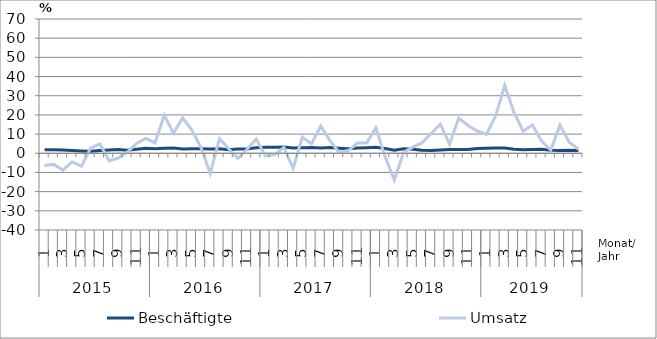
| Category | Beschäftigte | Umsatz |
|---|---|---|
| 0 | 1.8 | -6.4 |
| 1 | 1.8 | -5.8 |
| 2 | 1.7 | -8.8 |
| 3 | 1.5 | -4.4 |
| 4 | 1.2 | -6.8 |
| 5 | 1 | 2.7 |
| 6 | 1.4 | 4.9 |
| 7 | 1.7 | -3.9 |
| 8 | 2 | -2.5 |
| 9 | 1.6 | 0.6 |
| 10 | 2.1 | 5.1 |
| 11 | 2.6 | 7.7 |
| 12 | 2.4 | 5.4 |
| 13 | 2.6 | 19.9 |
| 14 | 2.7 | 10.5 |
| 15 | 2.2 | 18.4 |
| 16 | 2.3 | 12.1 |
| 17 | 2.3 | 2.9 |
| 18 | 2.2 | -10.5 |
| 19 | 2.4 | 7.6 |
| 20 | 1.8 | 2.4 |
| 21 | 2.2 | -2.7 |
| 22 | 2.2 | 2.1 |
| 23 | 2.9 | 7.4 |
| 24 | 3.2 | -1.5 |
| 25 | 3.2 | -0.7 |
| 26 | 3.3 | 3.1 |
| 27 | 2.7 | -7.9 |
| 28 | 2.9 | 8.4 |
| 29 | 3 | 5 |
| 30 | 2.8 | 14.2 |
| 31 | 3 | 6.6 |
| 32 | 2.6 | 0.4 |
| 33 | 2.3 | 1.4 |
| 34 | 2.7 | 5.3 |
| 35 | 2.9 | 5.4 |
| 36 | 3.1 | 13.3 |
| 37 | 2.5 | -2 |
| 38 | 1.6 | -13.9 |
| 39 | 2.4 | 0.4 |
| 40 | 2.1 | 3.2 |
| 41 | 1.6 | 5.4 |
| 42 | 1.5 | 10.3 |
| 43 | 1.7 | 15.2 |
| 44 | 2 | 4.7 |
| 45 | 2 | 18.4 |
| 46 | 2 | 14.5 |
| 47 | 2.5 | 11.6 |
| 48 | 2.6 | 9.8 |
| 49 | 2.8 | 19.4 |
| 50 | 2.8 | 35.4 |
| 51 | 2.1 | 21.3 |
| 52 | 1.8 | 11.5 |
| 53 | 2 | 14.8 |
| 54 | 2.1 | 6.3 |
| 55 | 1.6 | 1.7 |
| 56 | 1.5 | 14.7 |
| 57 | 1.6 | 5.8 |
| 58 | 1.5 | 2.2 |